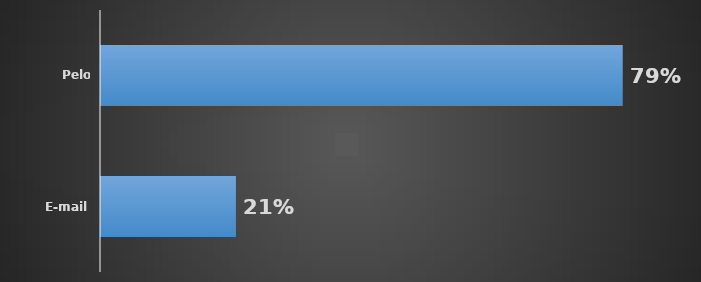
| Category | Total |
|---|---|
| E-mail | 0.205 |
| Pelo sistema, com aviso por e-mail | 0.795 |